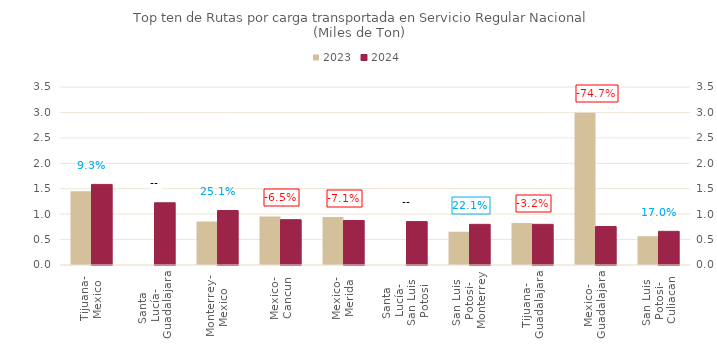
| Category | 2023 | 2024 |
|---|---|---|
| Tijuana-
Mexico | 1449.654 | 1584.725 |
| Santa 
Lucía-
Guadalajara | 0 | 1223.129 |
| Monterrey-
Mexico | 855.511 | 1070.354 |
| Mexico-
Cancun | 952.612 | 891.086 |
| Mexico-
Merida | 941.585 | 874.743 |
| Santa 
Lucía-
San Luis 
Potosi | 0 | 853.39 |
| San Luis 
Potosi-
Monterrey | 654.58 | 799.276 |
| Tijuana-
Guadalajara | 825.447 | 799.139 |
| Mexico-
Guadalajara | 2992.851 | 756.411 |
| San Luis 
Potosi-
Culiacan | 566.029 | 662.079 |